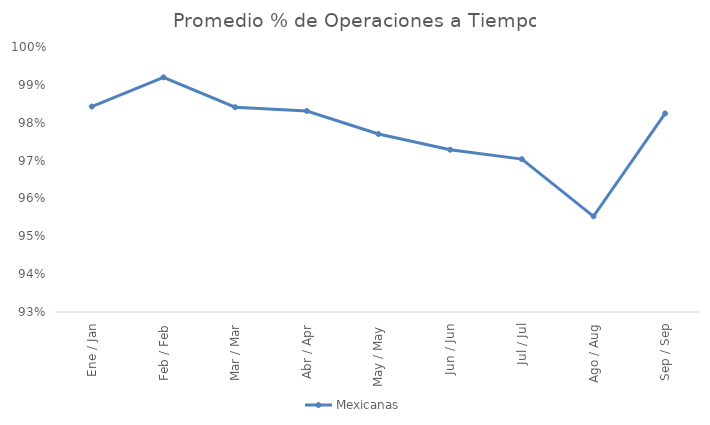
| Category | Mexicanas |
|---|---|
| Ene / Jan | 0.984 |
| Feb / Feb | 0.992 |
| Mar / Mar | 0.984 |
| Abr / Apr | 0.983 |
| May / May | 0.977 |
| Jun / Jun | 0.973 |
| Jul / Jul | 0.97 |
| Ago / Aug | 0.955 |
| Sep / Sep | 0.982 |